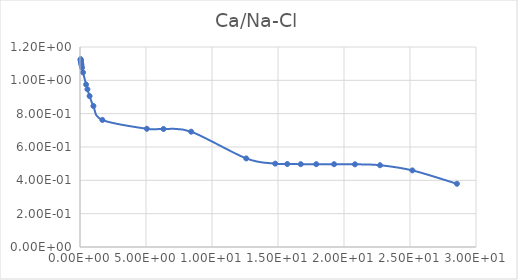
| Category | Series 0 |
|---|---|
| 0.045802 | 1.127 |
| 0.050891 | 1.124 |
| 0.057266 | 1.12 |
| 0.065465 | 1.115 |
| 0.076382 | 1.109 |
| 0.091701 | 1.101 |
| 0.11466 | 1.091 |
| 0.15303 | 1.075 |
| 0.22981 | 1.047 |
| 0.46205 | 0.975 |
| 0.56468 | 0.946 |
| 0.72591 | 0.906 |
| 1.016 | 0.846 |
| 1.6924 | 0.762 |
| 5.0651 | 0.709 |
| 6.3257 | 0.708 |
| 8.4218 | 0.692 |
| 12.594 | 0.531 |
| 14.79 | 0.5 |
| 15.7 | 0.498 |
| 16.727 | 0.497 |
| 17.897 | 0.497 |
| 19.248 | 0.497 |
| 20.83 | 0.496 |
| 22.728 | 0.491 |
| 25.18 | 0.46 |
| 28.556 | 0.379 |